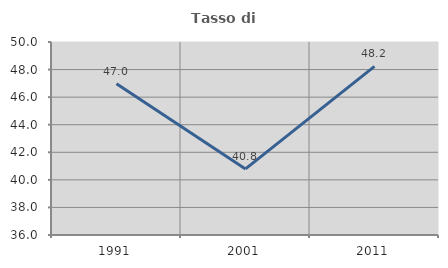
| Category | Tasso di occupazione   |
|---|---|
| 1991.0 | 46.977 |
| 2001.0 | 40.796 |
| 2011.0 | 48.235 |